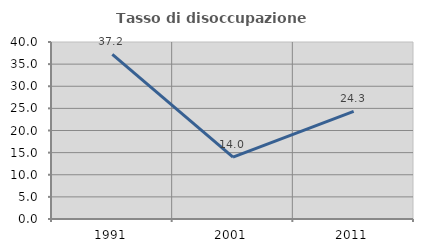
| Category | Tasso di disoccupazione giovanile  |
|---|---|
| 1991.0 | 37.209 |
| 2001.0 | 14 |
| 2011.0 | 24.324 |